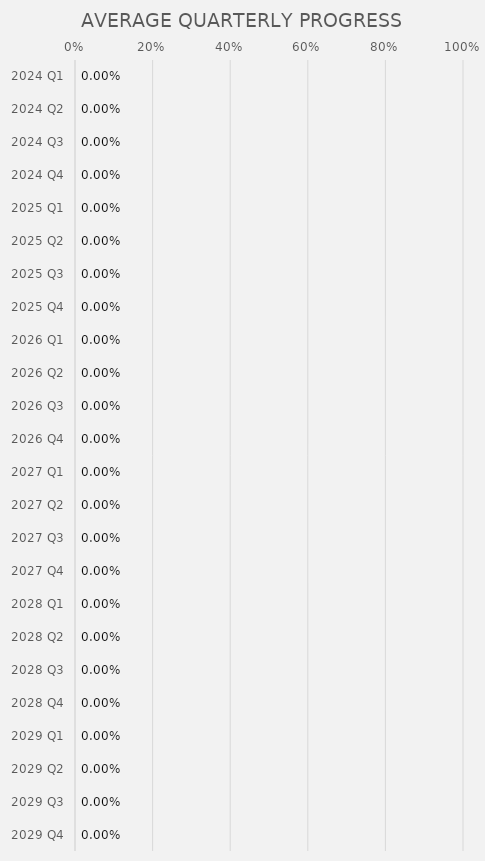
| Category | Series 0 |
|---|---|
| 2024 Q1 | 0 |
| 2024 Q2 | 0 |
| 2024 Q3 | 0 |
| 2024 Q4 | 0 |
| 2025 Q1 | 0 |
| 2025 Q2 | 0 |
| 2025 Q3 | 0 |
| 2025 Q4 | 0 |
| 2026 Q1 | 0 |
| 2026 Q2 | 0 |
| 2026 Q3 | 0 |
| 2026 Q4 | 0 |
| 2027 Q1 | 0 |
| 2027 Q2 | 0 |
| 2027 Q3 | 0 |
| 2027 Q4 | 0 |
| 2028 Q1 | 0 |
| 2028 Q2 | 0 |
| 2028 Q3 | 0 |
| 2028 Q4 | 0 |
| 2029 Q1 | 0 |
| 2029 Q2 | 0 |
| 2029 Q3 | 0 |
| 2029 Q4 | 0 |